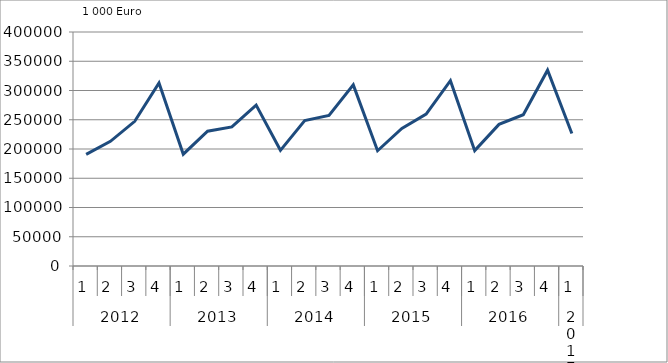
| Category | Ausbaugewerblicher Umsatz3 |
|---|---|
| 0 | 190755 |
| 1 | 213167 |
| 2 | 247277 |
| 3 | 312946 |
| 4 | 191088.978 |
| 5 | 230353.875 |
| 6 | 237735.574 |
| 7 | 275098.219 |
| 8 | 197732.754 |
| 9 | 248690.349 |
| 10 | 257339.084 |
| 11 | 309632.186 |
| 12 | 197030.42 |
| 13 | 235094.994 |
| 14 | 259758.438 |
| 15 | 316833.232 |
| 16 | 197219.532 |
| 17 | 242069.899 |
| 18 | 258547.84 |
| 19 | 334764.305 |
| 20 | 226552.317 |